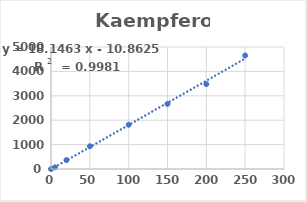
| Category | Series 0 |
|---|---|
| 0.0 | 0 |
| 5.0 | 66.519 |
| 20.0 | 367.264 |
| 50.0 | 931.43 |
| 100.0 | 1813.542 |
| 150.0 | 2666.853 |
| 200.0 | 3478.847 |
| 250.0 | 4652.058 |